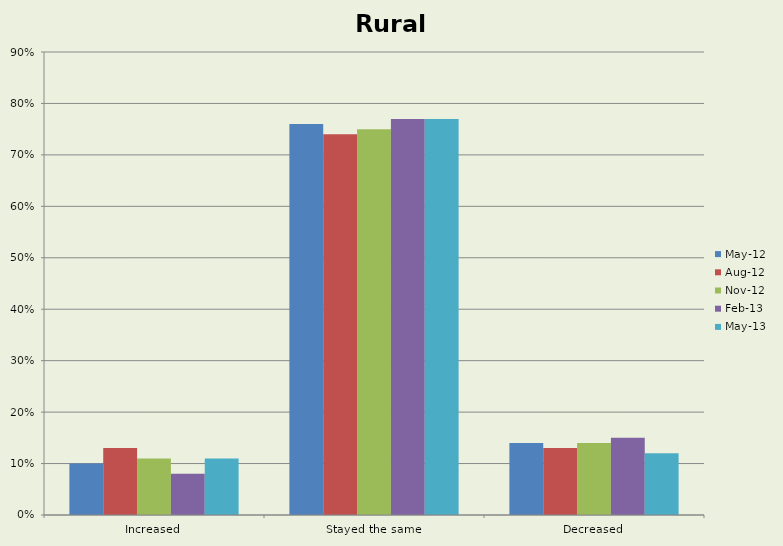
| Category | May-12 | Aug-12 | Nov-12 | Feb-13 | May-13 |
|---|---|---|---|---|---|
| Increased | 0.1 | 0.13 | 0.11 | 0.08 | 0.11 |
| Stayed the same | 0.76 | 0.74 | 0.75 | 0.77 | 0.77 |
| Decreased | 0.14 | 0.13 | 0.14 | 0.15 | 0.12 |